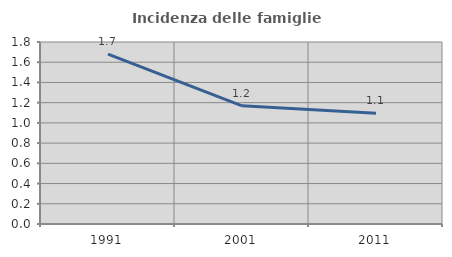
| Category | Incidenza delle famiglie numerose |
|---|---|
| 1991.0 | 1.681 |
| 2001.0 | 1.169 |
| 2011.0 | 1.095 |